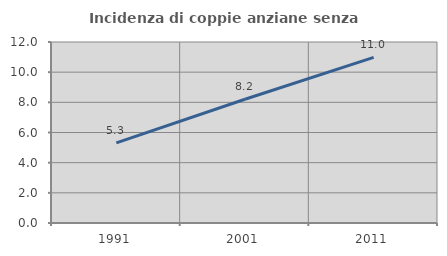
| Category | Incidenza di coppie anziane senza figli  |
|---|---|
| 1991.0 | 5.312 |
| 2001.0 | 8.205 |
| 2011.0 | 10.983 |